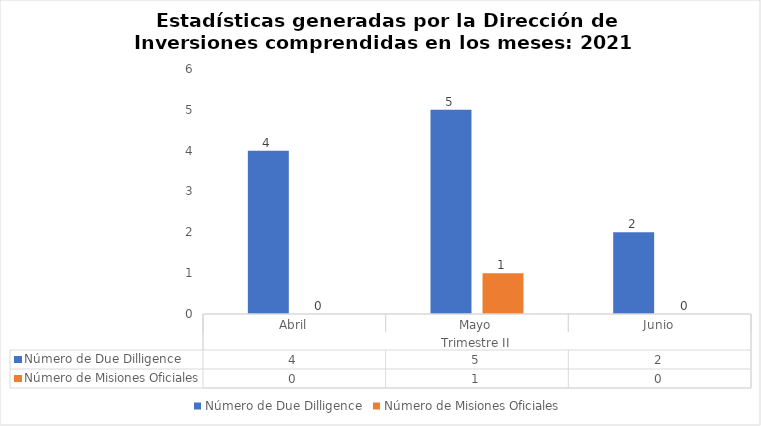
| Category | Número de Due Dilligence | Número de Misiones Oficiales |
|---|---|---|
| 0 | 4 | 0 |
| 1 | 5 | 1 |
| 2 | 2 | 0 |